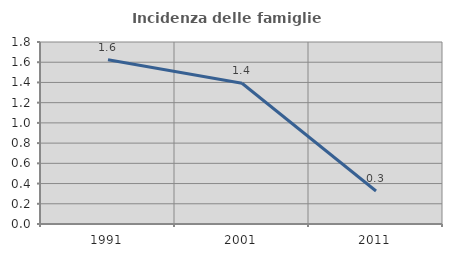
| Category | Incidenza delle famiglie numerose |
|---|---|
| 1991.0 | 1.624 |
| 2001.0 | 1.392 |
| 2011.0 | 0.326 |